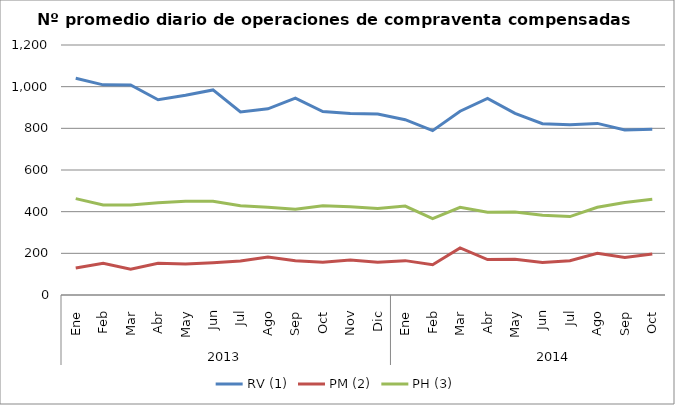
| Category | RV (1) | PM (2) | PH (3) |
|---|---|---|---|
| 0 | 1040.636 | 129.682 | 462.545 |
| 1 | 1008.7 | 152.35 | 432.05 |
| 2 | 1008.45 | 123.6 | 431.9 |
| 3 | 937.091 | 152.273 | 442.545 |
| 4 | 958.381 | 148.429 | 449.571 |
| 5 | 984.3 | 154.95 | 450 |
| 6 | 878.955 | 163.091 | 427.955 |
| 7 | 893.762 | 182.333 | 420.857 |
| 8 | 945.278 | 164.944 | 411.222 |
| 9 | 880.5 | 156.955 | 428.864 |
| 10 | 871.35 | 167.95 | 423.25 |
| 11 | 868.85 | 156.75 | 415.75 |
| 12 | 841.591 | 164.955 | 427.091 |
| 13 | 788.8 | 144.95 | 366.85 |
| 14 | 882.238 | 225.667 | 421.238 |
| 15 | 944 | 170.238 | 397.381 |
| 16 | 871.55 | 171.45 | 398.25 |
| 17 | 822.476 | 155.857 | 382.905 |
| 18 | 816.818 | 164.682 | 376.318 |
| 19 | 823.65 | 200.7 | 421.15 |
| 20 | 791.85 | 180.5 | 444.45 |
| 21 | 795.045 | 197.045 | 459.864 |